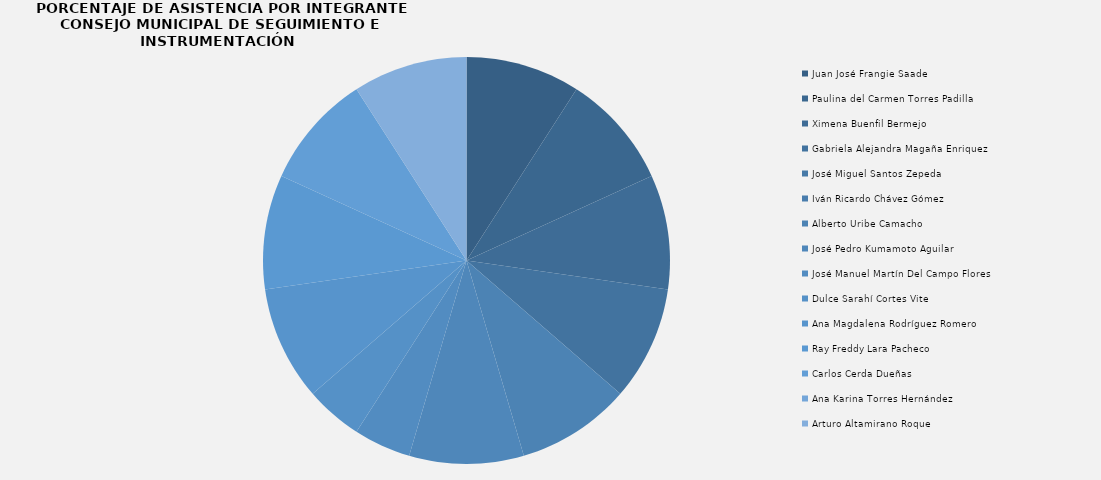
| Category | Juan José Frangie Saade |
|---|---|
| Juan José Frangie Saade | 2 |
| Paulina del Carmen Torres Padilla | 2 |
| Ximena Buenfil Bermejo | 2 |
| Gabriela Alejandra Magaña Enriquez | 2 |
| José Miguel Santos Zepeda | 0 |
| Iván Ricardo Chávez Gómez | 0 |
| Alberto Uribe Camacho | 2 |
| José Pedro Kumamoto Aguilar | 2 |
| José Manuel Martín Del Campo Flores | 1 |
| Dulce Sarahí Cortes Vite | 1 |
| Ana Magdalena Rodríguez Romero | 2 |
| Ray Freddy Lara Pacheco | 2 |
| Carlos Cerda Dueñas | 2 |
| Ana Karina Torres Hernández | 0 |
| Arturo Altamirano Roque  | 2 |